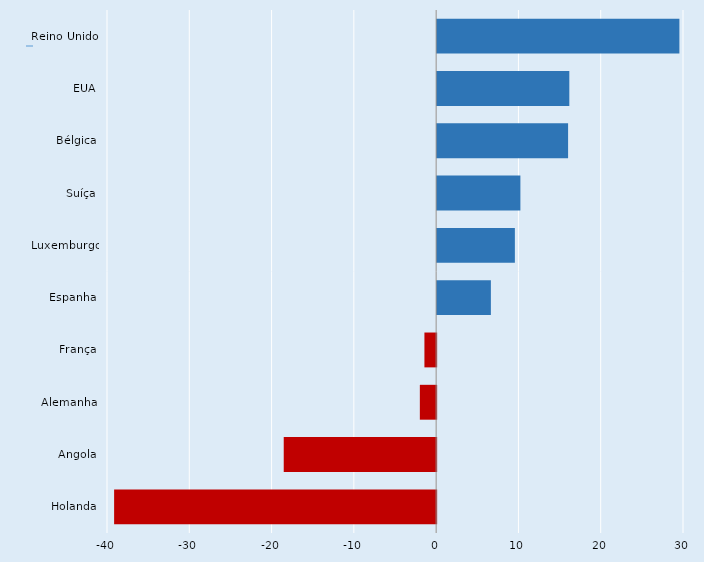
| Category | Series 0 |
|---|---|
| Reino Unido | 29.44 |
| EUA | 16.063 |
| Bélgica | 15.914 |
| Suíça | 10.118 |
|      Luxemburgo | 9.447 |
| Espanha | 6.53 |
| França | -1.425 |
| Alemanha | -1.981 |
| Angola | -18.522 |
| Holanda | -39.135 |